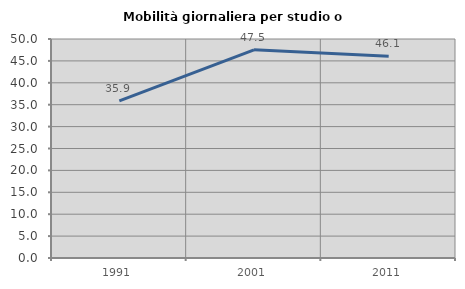
| Category | Mobilità giornaliera per studio o lavoro |
|---|---|
| 1991.0 | 35.875 |
| 2001.0 | 47.518 |
| 2011.0 | 46.084 |